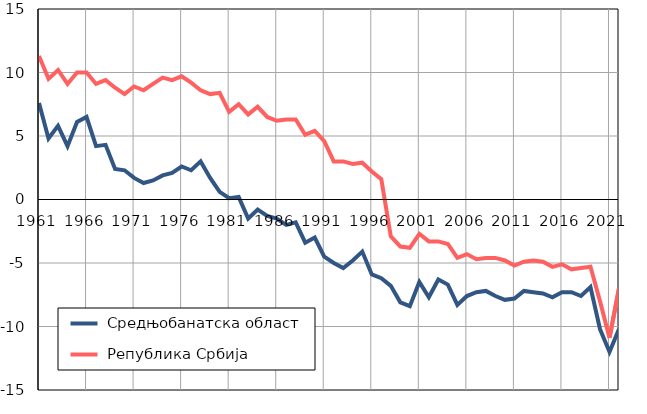
| Category |  Средњобанатска област |  Република Србија |
|---|---|---|
| 1961.0 | 7.6 | 11.3 |
| 1962.0 | 4.8 | 9.5 |
| 1963.0 | 5.8 | 10.2 |
| 1964.0 | 4.2 | 9.1 |
| 1965.0 | 6.1 | 10 |
| 1966.0 | 6.5 | 10 |
| 1967.0 | 4.2 | 9.1 |
| 1968.0 | 4.3 | 9.4 |
| 1969.0 | 2.4 | 8.8 |
| 1970.0 | 2.3 | 8.3 |
| 1971.0 | 1.7 | 8.9 |
| 1972.0 | 1.3 | 8.6 |
| 1973.0 | 1.5 | 9.1 |
| 1974.0 | 1.9 | 9.6 |
| 1975.0 | 2.1 | 9.4 |
| 1976.0 | 2.6 | 9.7 |
| 1977.0 | 2.3 | 9.2 |
| 1978.0 | 3 | 8.6 |
| 1979.0 | 1.7 | 8.3 |
| 1980.0 | 0.6 | 8.4 |
| 1981.0 | 0.1 | 6.9 |
| 1982.0 | 0.2 | 7.5 |
| 1983.0 | -1.5 | 6.7 |
| 1984.0 | -0.8 | 7.3 |
| 1985.0 | -1.3 | 6.5 |
| 1986.0 | -1.5 | 6.2 |
| 1987.0 | -2 | 6.3 |
| 1988.0 | -1.8 | 6.3 |
| 1989.0 | -3.4 | 5.1 |
| 1990.0 | -3 | 5.4 |
| 1991.0 | -4.5 | 4.6 |
| 1992.0 | -5 | 3 |
| 1993.0 | -5.4 | 3 |
| 1994.0 | -4.8 | 2.8 |
| 1995.0 | -4.1 | 2.9 |
| 1996.0 | -5.9 | 2.2 |
| 1997.0 | -6.2 | 1.6 |
| 1998.0 | -6.8 | -2.9 |
| 1999.0 | -8.1 | -3.7 |
| 2000.0 | -8.4 | -3.8 |
| 2001.0 | -6.5 | -2.7 |
| 2002.0 | -7.7 | -3.3 |
| 2003.0 | -6.3 | -3.3 |
| 2004.0 | -6.7 | -3.5 |
| 2005.0 | -8.3 | -4.6 |
| 2006.0 | -7.6 | -4.3 |
| 2007.0 | -7.3 | -4.7 |
| 2008.0 | -7.2 | -4.6 |
| 2009.0 | -7.6 | -4.6 |
| 2010.0 | -7.9 | -4.8 |
| 2011.0 | -7.8 | -5.2 |
| 2012.0 | -7.2 | -4.9 |
| 2013.0 | -7.3 | -4.8 |
| 2014.0 | -7.4 | -4.9 |
| 2015.0 | -7.7 | -5.3 |
| 2016.0 | -7.3 | -5.1 |
| 2017.0 | -7.3 | -5.5 |
| 2018.0 | -7.6 | -5.4 |
| 2019.0 | -6.9 | -5.3 |
| 2020.0 | -10.2 | -8 |
| 2021.0 | -12 | -10.9 |
| 2022.0 | -10.2 | -7 |